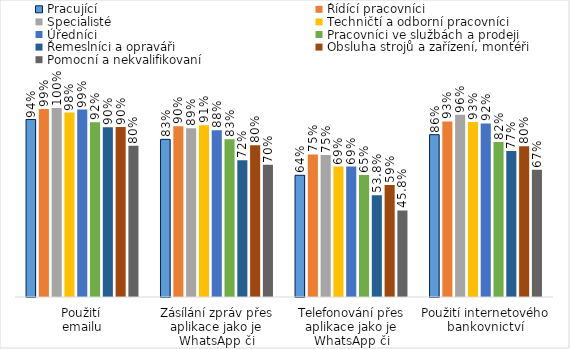
| Category | Pracující | Řídící pracovníci | Specialisté | Techničtí a odborní pracovníci | Úředníci | Pracovníci ve službách a prodeji | Řemeslníci a opraváři | Obsluha strojů a zařízení, montéři | Pomocní a nekvalifikovaní |
|---|---|---|---|---|---|---|---|---|---|
| Použití 
emailu | 0.938 | 0.994 | 0.999 | 0.975 | 0.991 | 0.924 | 0.898 | 0.899 | 0.799 |
| Zásílání zpráv přes aplikace jako je WhatsApp či Messenger | 0.833 | 0.903 | 0.893 | 0.908 | 0.882 | 0.834 | 0.723 | 0.802 | 0.699 |
| Telefonování přes aplikace jako je WhatsApp či Messenger | 0.643 | 0.753 | 0.75 | 0.689 | 0.69 | 0.646 | 0.538 | 0.592 | 0.458 |
| Použití internetového bankovnictví | 0.858 | 0.928 | 0.964 | 0.926 | 0.918 | 0.82 | 0.772 | 0.796 | 0.673 |